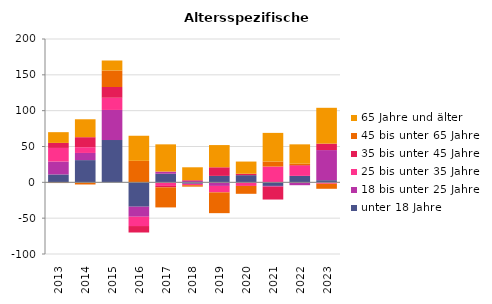
| Category | unter 18 Jahre | 18 bis unter 25 Jahre | 25 bis unter 35 Jahre | 35 bis unter 45 Jahre | 45 bis unter 65 Jahre | 65 Jahre und älter |
|---|---|---|---|---|---|---|
| 2013.0 | 11 | 18 | 19 | 7 | -1 | 15 |
| 2014.0 | 31 | 10 | 8 | 14 | -3 | 25 |
| 2015.0 | 59 | 42 | 17 | 15 | 23 | 14 |
| 2016.0 | -34 | -14 | -13 | -9 | 30 | 35 |
| 2017.0 | 12 | 3 | -5 | -2 | -28 | 38 |
| 2018.0 | -2 | 2 | -2 | 1 | -2 | 18 |
| 2019.0 | 9 | -5 | -9 | 12 | -29 | 31 |
| 2020.0 | 10 | 0 | -5 | 2 | -11 | 17 |
| 2021.0 | -5 | -1 | 22 | -18 | 7 | 40 |
| 2022.0 | 9 | -4 | 14 | 1 | 2 | 27 |
| 2023.0 | 3 | 42 | -2 | 9 | -7 | 50 |